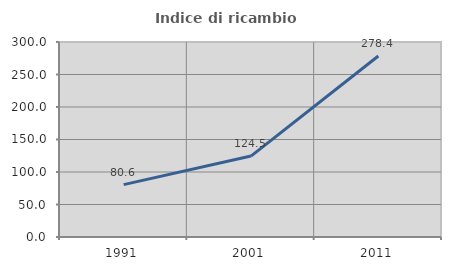
| Category | Indice di ricambio occupazionale  |
|---|---|
| 1991.0 | 80.556 |
| 2001.0 | 124.487 |
| 2011.0 | 278.419 |